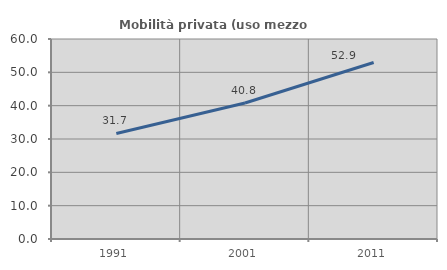
| Category | Mobilità privata (uso mezzo privato) |
|---|---|
| 1991.0 | 31.675 |
| 2001.0 | 40.813 |
| 2011.0 | 52.941 |